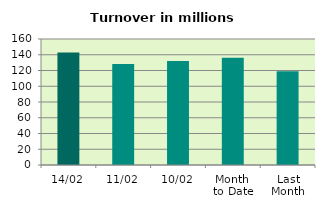
| Category | Series 0 |
|---|---|
| 14/02 | 143.004 |
| 11/02 | 128.408 |
| 10/02 | 132.115 |
| Month 
to Date | 136.078 |
| Last
Month | 119.055 |